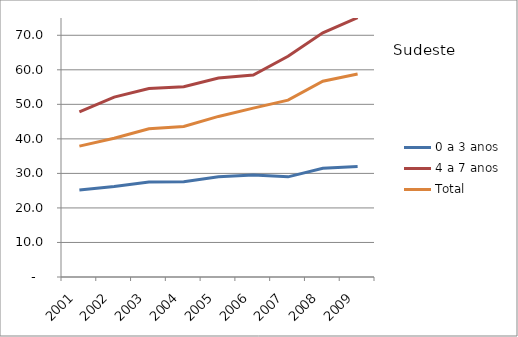
| Category | 0 a 3 anos | 4 a 7 anos | Total |
|---|---|---|---|
| 2001.0 | 25.2 | 47.8 | 37.9 |
| 2002.0 | 26.2 | 52.1 | 40.2 |
| 2003.0 | 27.5 | 54.6 | 42.9 |
| 2004.0 | 27.6 | 55.1 | 43.6 |
| 2005.0 | 29 | 57.6 | 46.5 |
| 2006.0 | 29.5 | 58.5 | 48.9 |
| 2007.0 | 29 | 63.9 | 51.2 |
| 2008.0 | 31.5 | 70.7 | 56.7 |
| 2009.0 | 32 | 75.1 | 58.8 |